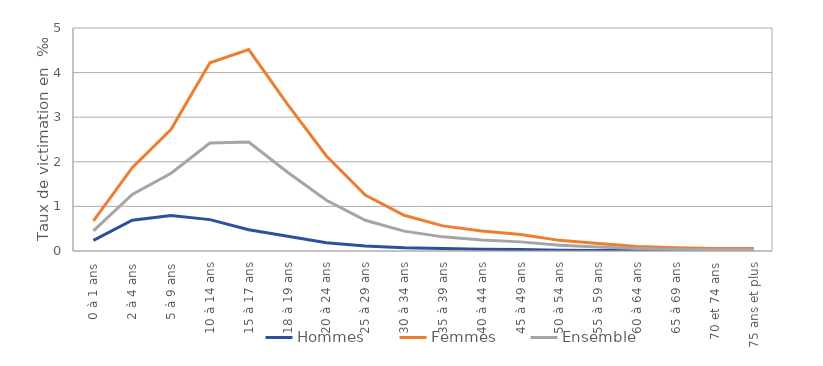
| Category | Hommes | Femmes | Ensemble |
|---|---|---|---|
| 0 à 1 ans | 0.239 | 0.674 | 0.452 |
| 2 à 4 ans | 0.689 | 1.869 | 1.266 |
| 5 à 9 ans | 0.796 | 2.729 | 1.742 |
| 10 à 14 ans | 0.704 | 4.22 | 2.421 |
| 15 à 17 ans | 0.476 | 4.516 | 2.442 |
| 18 à 19 ans | 0.331 | 3.286 | 1.766 |
| 20 à 24 ans | 0.184 | 2.131 | 1.139 |
| 25 à 29 ans | 0.111 | 1.256 | 0.688 |
| 30 à 34 ans | 0.072 | 0.801 | 0.446 |
| 35 à 39 ans | 0.056 | 0.563 | 0.317 |
| 40 à 44 ans | 0.037 | 0.448 | 0.246 |
| 45 à 49 ans | 0.034 | 0.371 | 0.205 |
| 50 à 54 ans | 0.018 | 0.238 | 0.13 |
| 55 à 59 ans | 0.014 | 0.166 | 0.092 |
| 60 à 64 ans | 0.009 | 0.102 | 0.057 |
| 65 à 69 ans | 0.006 | 0.073 | 0.041 |
| 70 et 74 ans | 0.002 | 0.056 | 0.031 |
| 75 ans et plus | 0.004 | 0.055 | 0.035 |